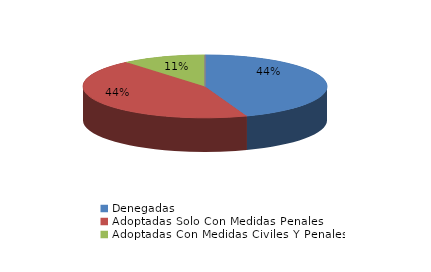
| Category | Series 0 |
|---|---|
| Denegadas | 4 |
| Adoptadas Solo Con Medidas Penales | 4 |
| Adoptadas Con Medidas Civiles Y Penales | 1 |
| Adoptadas Con Medidas Solo Civiles | 0 |